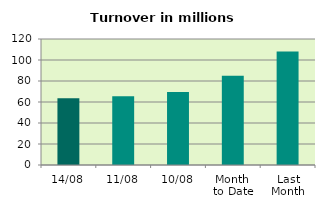
| Category | Series 0 |
|---|---|
| 14/08 | 63.629 |
| 11/08 | 65.421 |
| 10/08 | 69.439 |
| Month 
to Date | 84.884 |
| Last
Month | 108.022 |